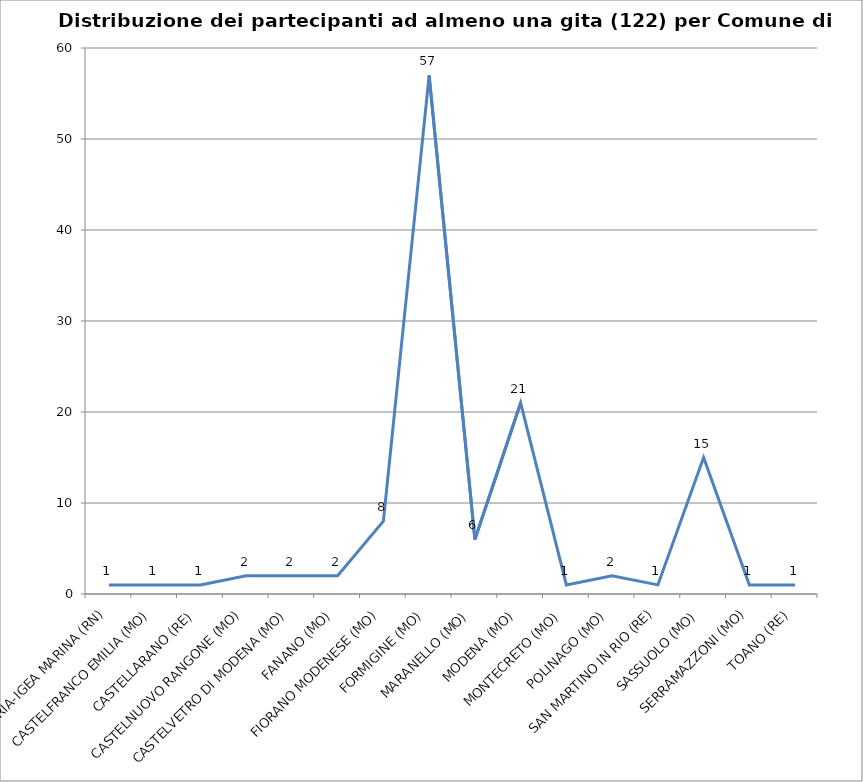
| Category | Nr. Tesserati |
|---|---|
| BELLARIA-IGEA MARINA (RN) | 1 |
| CASTELFRANCO EMILIA (MO) | 1 |
| CASTELLARANO (RE) | 1 |
| CASTELNUOVO RANGONE (MO) | 2 |
| CASTELVETRO DI MODENA (MO) | 2 |
| FANANO (MO) | 2 |
| FIORANO MODENESE (MO) | 8 |
| FORMIGINE (MO) | 57 |
| MARANELLO (MO) | 6 |
| MODENA (MO) | 21 |
| MONTECRETO (MO) | 1 |
| POLINAGO (MO) | 2 |
| SAN MARTINO IN RIO (RE) | 1 |
| SASSUOLO (MO) | 15 |
| SERRAMAZZONI (MO) | 1 |
| TOANO (RE) | 1 |